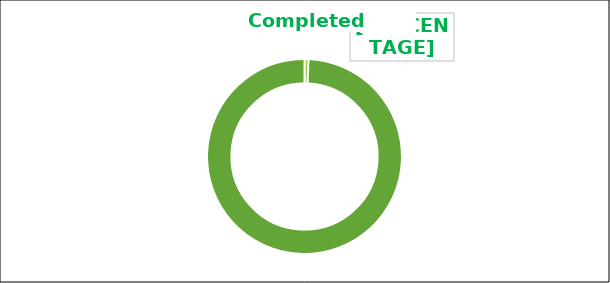
| Category | Series 0 |
|---|---|
| 0 | 2 |
| 1 | 298 |